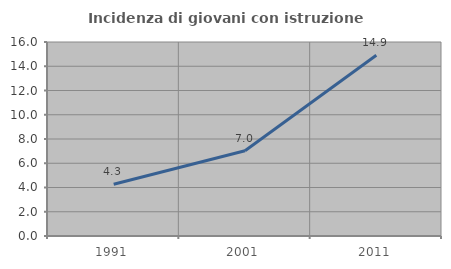
| Category | Incidenza di giovani con istruzione universitaria |
|---|---|
| 1991.0 | 4.274 |
| 2001.0 | 7.029 |
| 2011.0 | 14.901 |